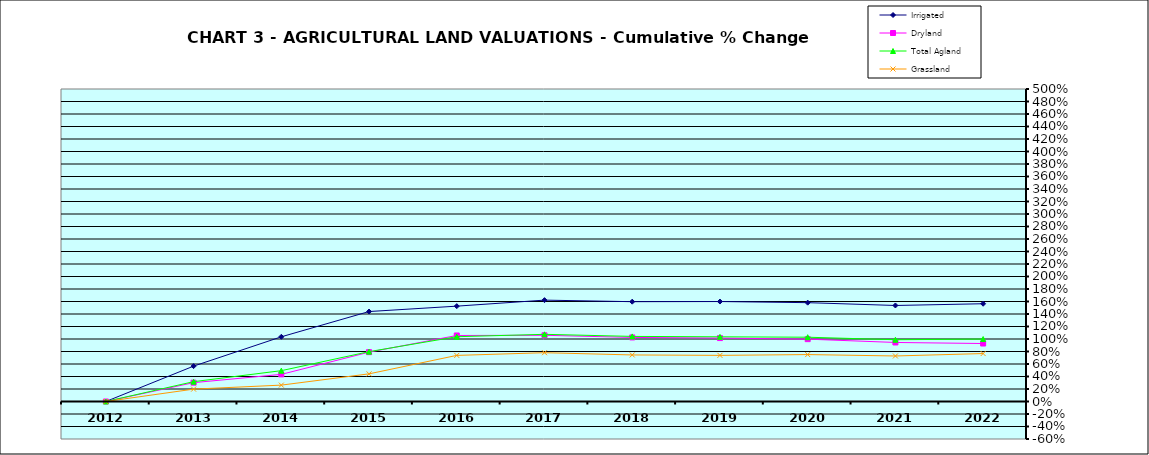
| Category | Irrigated | Dryland | Total Agland | Grassland |
|---|---|---|---|---|
| 2012.0 | 0 | 0 | 0 | 0 |
| 2013.0 | 0.566 | 0.302 | 0.317 | 0.198 |
| 2014.0 | 1.035 | 0.434 | 0.493 | 0.262 |
| 2015.0 | 1.439 | 0.79 | 0.798 | 0.442 |
| 2016.0 | 1.526 | 1.056 | 1.037 | 0.738 |
| 2017.0 | 1.622 | 1.059 | 1.075 | 0.781 |
| 2018.0 | 1.597 | 1.025 | 1.042 | 0.745 |
| 2019.0 | 1.599 | 1.015 | 1.035 | 0.738 |
| 2020.0 | 1.581 | 0.998 | 1.029 | 0.751 |
| 2021.0 | 1.536 | 0.945 | 0.988 | 0.728 |
| 2022.0 | 1.564 | 0.928 | 0.999 | 0.767 |